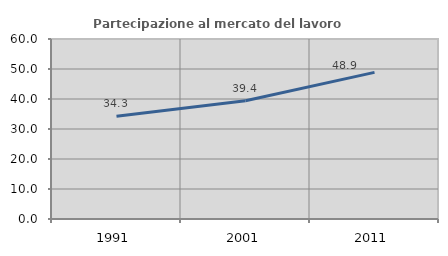
| Category | Partecipazione al mercato del lavoro  femminile |
|---|---|
| 1991.0 | 34.25 |
| 2001.0 | 39.419 |
| 2011.0 | 48.877 |